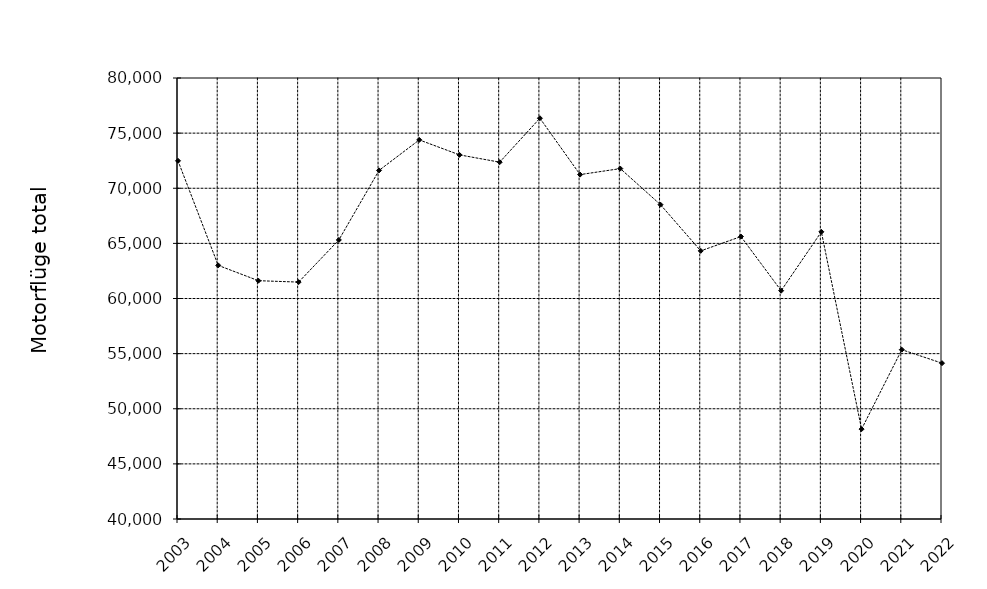
| Category | Motorflug |
|---|---|
| 2003.0 | 72488 |
| 2004.0 | 63005 |
| 2005.0 | 61615 |
| 2006.0 | 61487 |
| 2007.0 | 65311 |
| 2008.0 | 71619 |
| 2009.0 | 74386 |
| 2010.0 | 73028 |
| 2011.0 | 72365 |
| 2012.0 | 76351 |
| 2013.0 | 71238 |
| 2014.0 | 71782 |
| 2015.0 | 68507 |
| 2016.0 | 64320 |
| 2017.0 | 65618 |
| 2018.0 | 60709 |
| 2019.0 | 66048 |
| 2020.0 | 48151 |
| 2021.0 | 55358 |
| 2022.0 | 54134 |